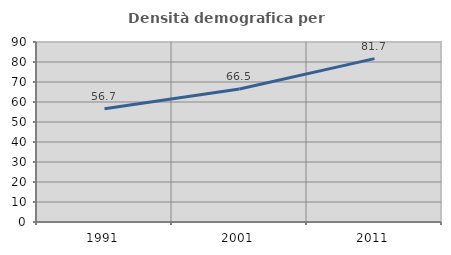
| Category | Densità demografica |
|---|---|
| 1991.0 | 56.678 |
| 2001.0 | 66.512 |
| 2011.0 | 81.688 |